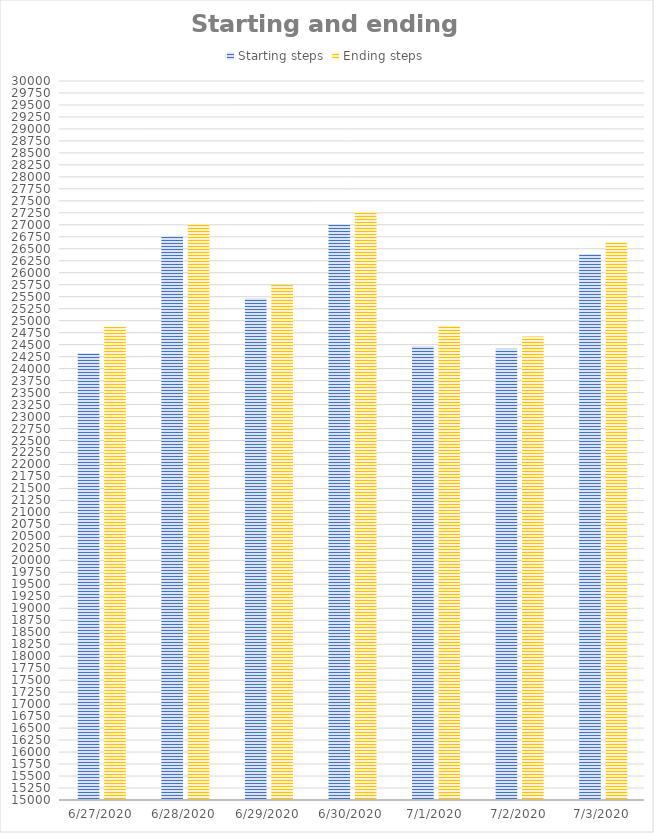
| Category | Starting steps | Ending steps |
|---|---|---|
| 6/27/20 | 24325 | 24867 |
| 6/28/20 | 26755 | 27012 |
| 6/29/20 | 25466 | 25744 |
| 6/30/20 | 27014 | 27264 |
| 7/1/20 | 24474 | 24889 |
| 7/2/20 | 24414 | 24672 |
| 7/3/20 | 26392 | 26642 |